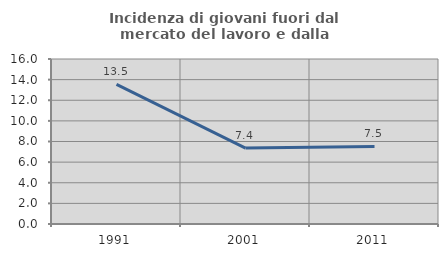
| Category | Incidenza di giovani fuori dal mercato del lavoro e dalla formazione  |
|---|---|
| 1991.0 | 13.538 |
| 2001.0 | 7.363 |
| 2011.0 | 7.516 |